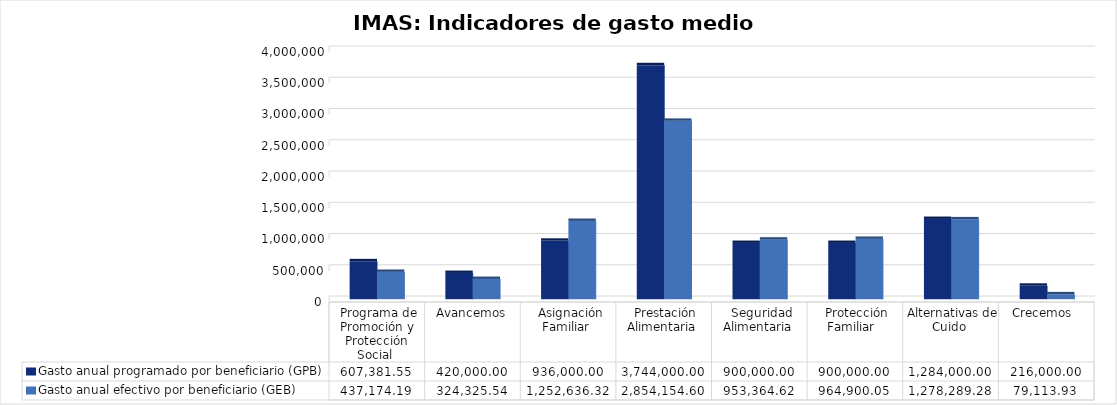
| Category | Gasto anual programado por beneficiario (GPB)  | Gasto anual efectivo por beneficiario (GEB)  |
|---|---|---|
| Programa de Promoción y Protección Social | 607381.546 | 437174.191 |
| Avancemos | 420000 | 324325.539 |
| Asignación Familiar | 936000 | 1252636.32 |
| Prestación Alimentaria | 3744000 | 2854154.601 |
| Seguridad Alimentaria | 900000 | 953364.617 |
| Protección Familiar  | 900000 | 964900.051 |
| Alternativas de Cuido | 1284000 | 1278289.276 |
| Crecemos  | 216000 | 79113.929 |